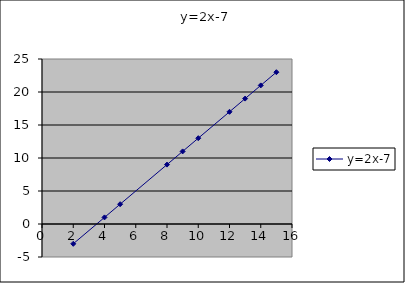
| Category | y=2x-7 |
|---|---|
| 2.0 | -3 |
| 4.0 | 1 |
| 5.0 | 3 |
| 8.0 | 9 |
| 9.0 | 11 |
| 10.0 | 13 |
| 12.0 | 17 |
| 13.0 | 19 |
| 14.0 | 21 |
| 15.0 | 23 |